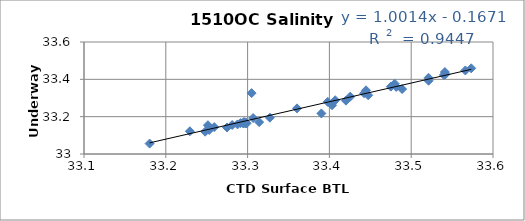
| Category | Series 0 |
|---|---|
| 33.4798 | 33.377 |
| 33.4751 | 33.361 |
| 33.5412 | 33.439 |
| 33.5662 | 33.448 |
| 33.54 | 33.423 |
| 33.5734 | 33.459 |
| 33.4255 | 33.307 |
| 33.2294 | 33.122 |
| 33.2515 | 33.154 |
| 33.2592 | 33.144 |
| 33.3604 | 33.244 |
| 33.3049 | 33.326 |
| 33.4448 | 33.341 |
| 33.5418 | 33.427 |
| 33.5212 | 33.408 |
| 33.4424 | 33.326 |
| 33.4071 | 33.288 |
| 33.398 | 33.279 |
| 33.4474 | 33.315 |
| 33.4817 | 33.359 |
| 33.3902 | 33.217 |
| 33.2481 | 33.12 |
| 33.3272 | 33.194 |
| 33.2977 | 33.169 |
| 33.2955 | 33.172 |
| 33.1802 | 33.056 |
| 33.2914 | 33.166 |
| 33.2812 | 33.155 |
| 33.2877 | 33.159 |
| 33.2748 | 33.142 |
| 33.4032 | 33.261 |
| 33.2977 | 33.164 |
| 33.2986 | 33.164 |
| 33.2949 | 33.164 |
| 33.2531 | 33.129 |
| 33.4889 | 33.348 |
| 33.5213 | 33.392 |
| 33.2951 | 33.164 |
| 33.3141 | 33.171 |
| 33.3068 | 33.192 |
| 33.4202 | 33.286 |